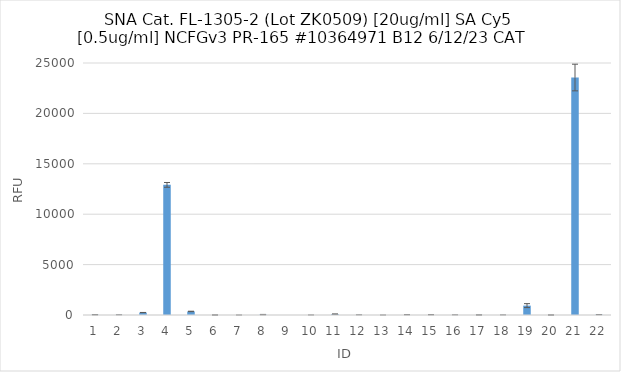
| Category | RFU |
|---|---|
| 0 | 29.75 |
| 1 | 10.75 |
| 2 | 243.75 |
| 3 | 12909.5 |
| 4 | 353.5 |
| 5 | 2.5 |
| 6 | 0 |
| 7 | 39.25 |
| 8 | -1.5 |
| 9 | 2.25 |
| 10 | 85.25 |
| 11 | 7.25 |
| 12 | 0 |
| 13 | -24 |
| 14 | -23.25 |
| 15 | 5.75 |
| 16 | 7.25 |
| 17 | 4 |
| 18 | 930.5 |
| 19 | 2 |
| 20 | 23559.75 |
| 21 | 40 |